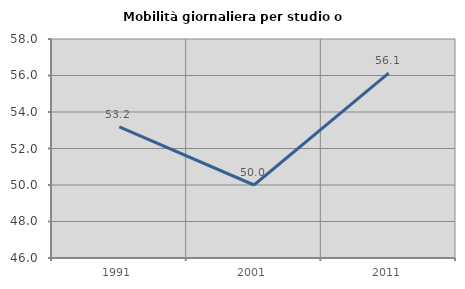
| Category | Mobilità giornaliera per studio o lavoro |
|---|---|
| 1991.0 | 53.179 |
| 2001.0 | 50 |
| 2011.0 | 56.126 |